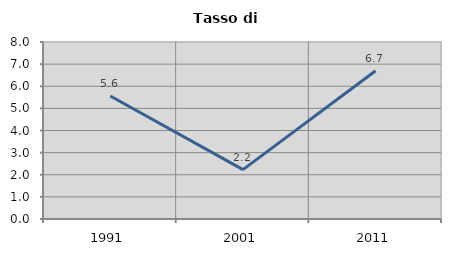
| Category | Tasso di disoccupazione   |
|---|---|
| 1991.0 | 5.559 |
| 2001.0 | 2.231 |
| 2011.0 | 6.697 |